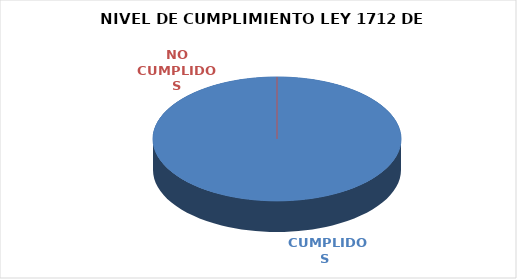
| Category | Series 0 |
|---|---|
|  CUMPLIDOS | 114 |
| NO CUMPLIDOS | 0 |